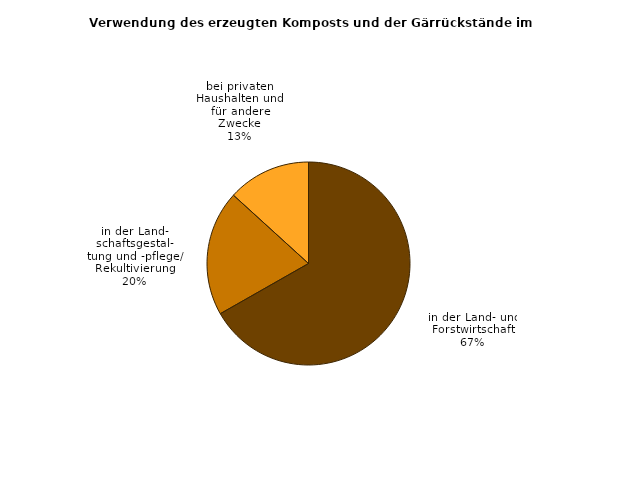
| Category | Series 0 |
|---|---|
| in der Land- und Forstwirtschaft | 240919 |
| in der Land-
schaftsgestal-
tung und -pflege/
Rekultivierung | 72123 |
| bei privaten
Haushalten und
für andere
Zwecke | 47816 |